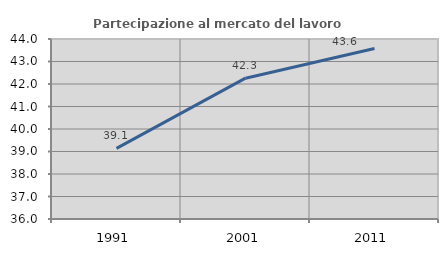
| Category | Partecipazione al mercato del lavoro  femminile |
|---|---|
| 1991.0 | 39.14 |
| 2001.0 | 42.259 |
| 2011.0 | 43.575 |